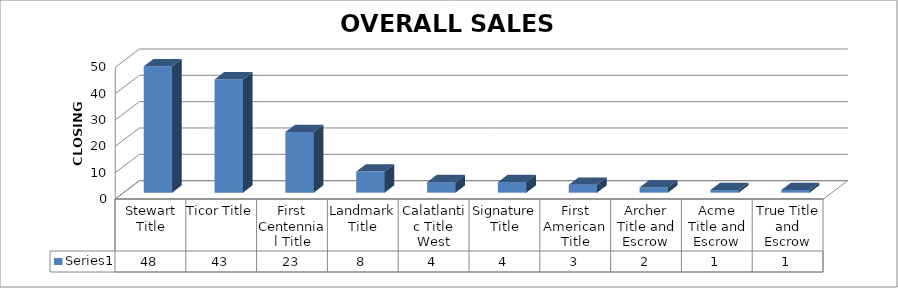
| Category | Series 0 |
|---|---|
| Stewart Title | 48 |
| Ticor Title | 43 |
| First Centennial Title | 23 |
| Landmark Title | 8 |
| Calatlantic Title West | 4 |
| Signature Title | 4 |
| First American Title | 3 |
| Archer Title and Escrow | 2 |
| Acme Title and Escrow | 1 |
| True Title and Escrow | 1 |